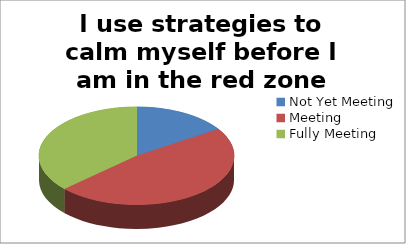
| Category | I use strategies to calm myself before I am in the red zone |
|---|---|
| Not Yet Meeting | 6 |
| Meeting | 18 |
| Fully Meeting | 14 |